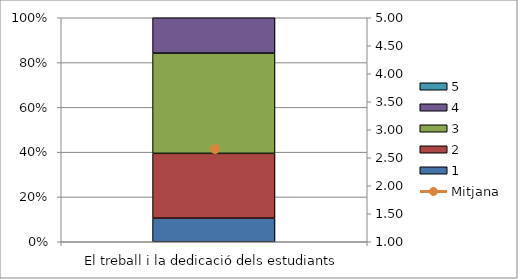
| Category | 1 | 2 | 3 | 4 | 5 |
|---|---|---|---|---|---|
| El treball i la dedicació dels estudiants | 4 | 11 | 17 | 6 | 0 |